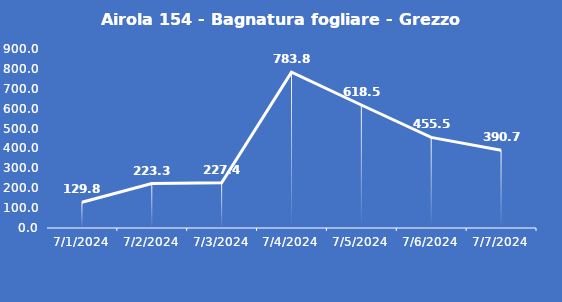
| Category | Airola 154 - Bagnatura fogliare - Grezzo (min) |
|---|---|
| 7/1/24 | 129.8 |
| 7/2/24 | 223.3 |
| 7/3/24 | 227.4 |
| 7/4/24 | 783.8 |
| 7/5/24 | 618.5 |
| 7/6/24 | 455.5 |
| 7/7/24 | 390.7 |